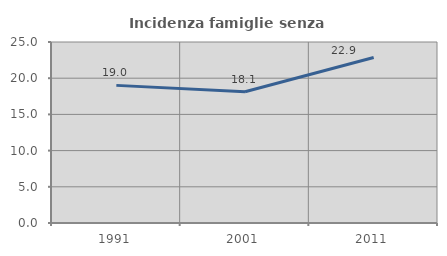
| Category | Incidenza famiglie senza nuclei |
|---|---|
| 1991.0 | 19.009 |
| 2001.0 | 18.121 |
| 2011.0 | 22.855 |